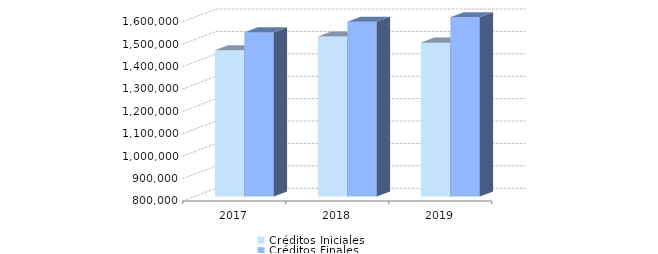
| Category | Créditos Iniciales | Créditos Finales |
|---|---|---|
| 2017.0 | 1452575 | 1532377.72 |
| 2018.0 | 1513893 | 1579757.67 |
| 2019.0 | 1487061.28 | 1774024.81 |